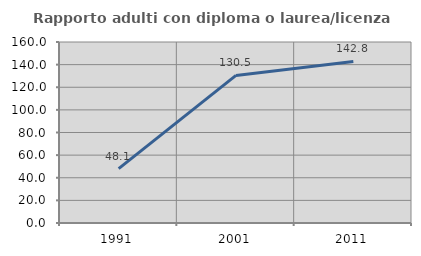
| Category | Rapporto adulti con diploma o laurea/licenza media  |
|---|---|
| 1991.0 | 48.095 |
| 2001.0 | 130.453 |
| 2011.0 | 142.767 |